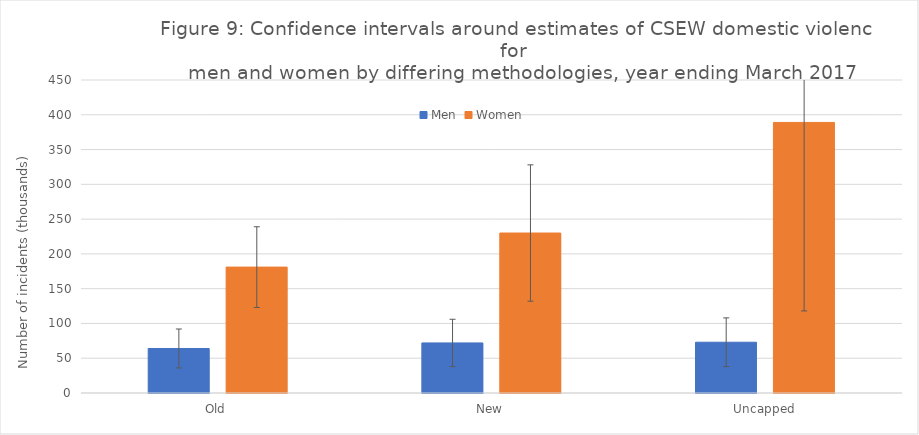
| Category | Men | Women |
|---|---|---|
| Old | 64 | 181 |
| New | 72 | 230 |
| Uncapped | 73 | 389 |